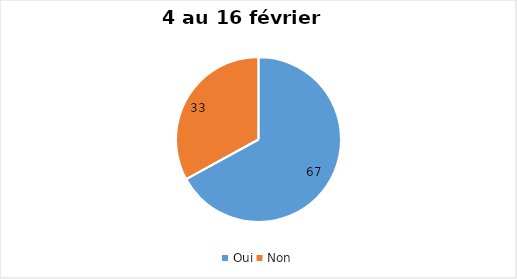
| Category | 4 au 16 février 2022 |
|---|---|
| Oui | 67 |
| Non | 33 |